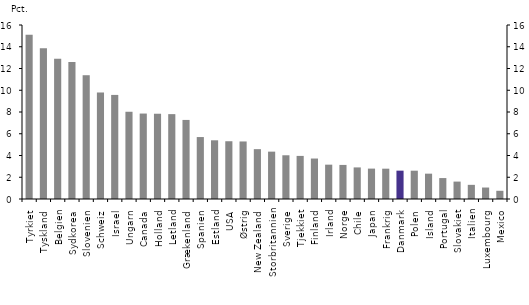
| Category | Ekstern finansiering fra erhvervslivet i pct. af samlet finansiering |
|---|---|
| Tyrkiet | 15.11 |
| Tyskland | 13.873 |
| Belgien | 12.89 |
| Sydkorea | 12.589 |
| Slovenien | 11.382 |
| Schweiz | 9.782 |
| Israel | 9.571 |
| Ungarn | 8.022 |
| Canada | 7.858 |
| Holland | 7.848 |
| Letland | 7.804 |
| Grækenland | 7.27 |
| Spanien | 5.697 |
| Estland | 5.398 |
| USA | 5.311 |
| Østrig | 5.291 |
| New Zealand | 4.583 |
| Storbritannien | 4.355 |
| Sverige | 4.021 |
| Tjekkiet | 3.962 |
| Finland | 3.722 |
| Irland | 3.158 |
| Norge | 3.134 |
| Chile | 2.904 |
| Japan | 2.795 |
| Frankrig | 2.788 |
| Danmark | 2.607 |
| Polen | 2.604 |
| Island | 2.33 |
| Portugal | 1.924 |
| Slovakiet | 1.6 |
| Italien | 1.302 |
| Luxembourg | 1.055 |
| Mexico | 0.755 |